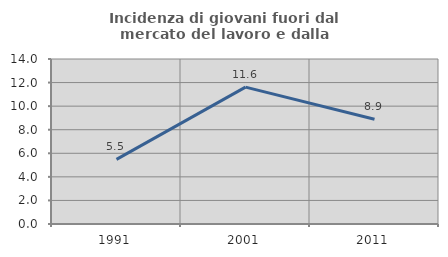
| Category | Incidenza di giovani fuori dal mercato del lavoro e dalla formazione  |
|---|---|
| 1991.0 | 5.485 |
| 2001.0 | 11.616 |
| 2011.0 | 8.889 |